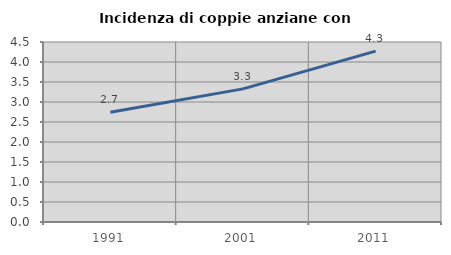
| Category | Incidenza di coppie anziane con figli |
|---|---|
| 1991.0 | 2.743 |
| 2001.0 | 3.328 |
| 2011.0 | 4.273 |